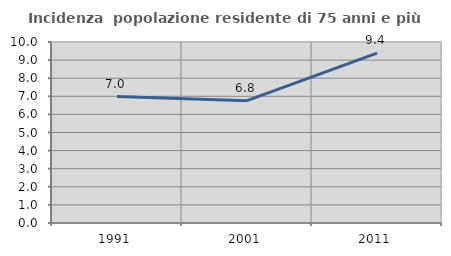
| Category | Incidenza  popolazione residente di 75 anni e più |
|---|---|
| 1991.0 | 6.987 |
| 2001.0 | 6.758 |
| 2011.0 | 9.388 |